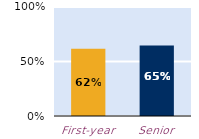
| Category | frequently |
|---|---|
| First-year | 0.617 |
| Senior | 0.647 |